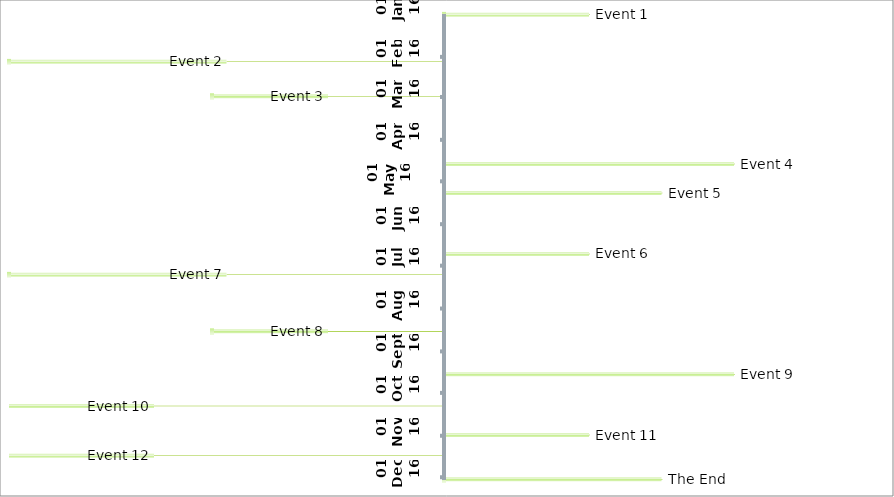
| Category | Series 0 |
|---|---|
| 2016-01-01 | 50 |
| 2016-02-04 | -75 |
| 2016-02-29 | -40 |
| 2016-04-18 | 100 |
| 2016-05-09 | 75 |
| 2016-06-22 | 50 |
| 2016-07-07 | -75 |
| 2016-08-17 | -40 |
| 2016-09-17 | 100 |
| 2016-10-10 | -100 |
| 2016-10-31 | 50 |
| 2016-11-15 | -100 |
| 2016-12-02 | 75 |